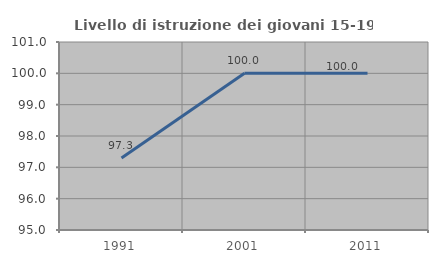
| Category | Livello di istruzione dei giovani 15-19 anni |
|---|---|
| 1991.0 | 97.297 |
| 2001.0 | 100 |
| 2011.0 | 100 |